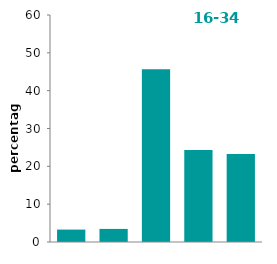
| Category | 16-34 |
|---|---|
| 0-15  | 3.283 |
| 16-20  | 3.459 |
| 21-25  | 45.68 |
| 26-30  | 24.303 |
| 31 or more | 23.275 |